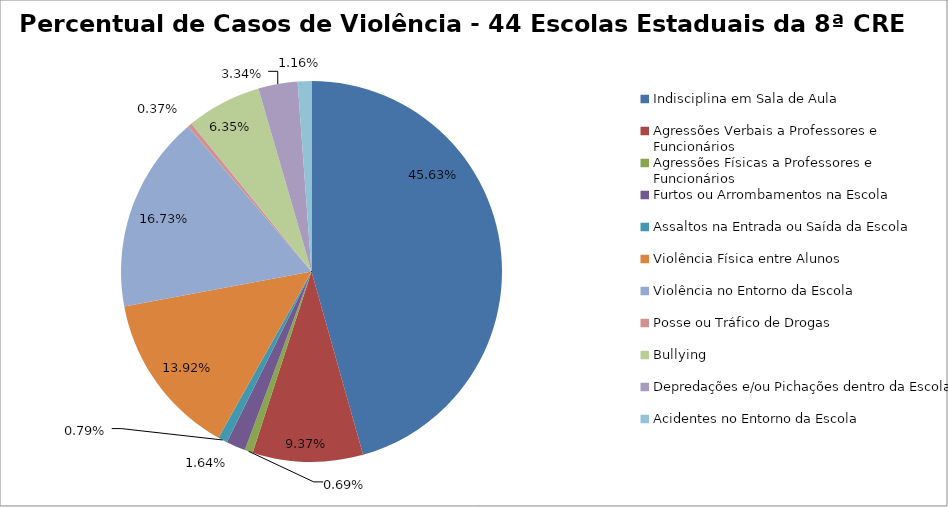
| Category | Percentual |
|---|---|
| Indisciplina em Sala de Aula | 0.456 |
| Agressões Verbais a Professores e Funcionários | 0.094 |
| Agressões Físicas a Professores e Funcionários | 0.007 |
| Furtos ou Arrombamentos na Escola | 0.016 |
| Assaltos na Entrada ou Saída da Escola | 0.008 |
| Violência Física entre Alunos | 0.139 |
| Violência no Entorno da Escola | 0.167 |
| Posse ou Tráfico de Drogas | 0.004 |
| Bullying | 0.064 |
| Depredações e/ou Pichações dentro da Escola | 0.033 |
| Acidentes no Entorno da Escola | 0.012 |